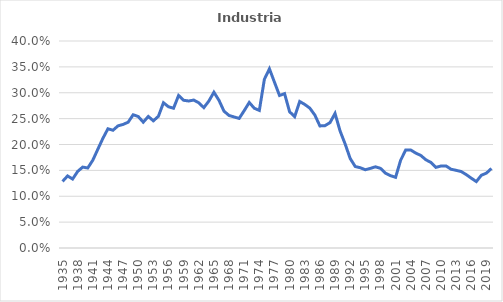
| Category | Industria manufacturera |
|---|---|
| 1935.0 | 0.129 |
| 1936.0 | 0.139 |
| 1937.0 | 0.133 |
| 1938.0 | 0.148 |
| 1939.0 | 0.156 |
| 1940.0 | 0.155 |
| 1941.0 | 0.17 |
| 1942.0 | 0.191 |
| 1943.0 | 0.212 |
| 1944.0 | 0.23 |
| 1945.0 | 0.228 |
| 1946.0 | 0.236 |
| 1947.0 | 0.239 |
| 1948.0 | 0.243 |
| 1949.0 | 0.257 |
| 1950.0 | 0.254 |
| 1951.0 | 0.243 |
| 1952.0 | 0.254 |
| 1953.0 | 0.246 |
| 1954.0 | 0.255 |
| 1955.0 | 0.281 |
| 1956.0 | 0.273 |
| 1957.0 | 0.27 |
| 1958.0 | 0.295 |
| 1959.0 | 0.285 |
| 1960.0 | 0.284 |
| 1961.0 | 0.286 |
| 1962.0 | 0.281 |
| 1963.0 | 0.271 |
| 1964.0 | 0.284 |
| 1965.0 | 0.301 |
| 1966.0 | 0.285 |
| 1967.0 | 0.264 |
| 1968.0 | 0.256 |
| 1969.0 | 0.253 |
| 1970.0 | 0.25 |
| 1971.0 | 0.265 |
| 1972.0 | 0.281 |
| 1973.0 | 0.27 |
| 1974.0 | 0.266 |
| 1975.0 | 0.326 |
| 1976.0 | 0.346 |
| 1977.0 | 0.32 |
| 1978.0 | 0.295 |
| 1979.0 | 0.298 |
| 1980.0 | 0.263 |
| 1981.0 | 0.254 |
| 1982.0 | 0.283 |
| 1983.0 | 0.277 |
| 1984.0 | 0.27 |
| 1985.0 | 0.257 |
| 1986.0 | 0.236 |
| 1987.0 | 0.236 |
| 1988.0 | 0.242 |
| 1989.0 | 0.26 |
| 1990.0 | 0.226 |
| 1991.0 | 0.201 |
| 1992.0 | 0.173 |
| 1993.0 | 0.157 |
| 1994.0 | 0.155 |
| 1995.0 | 0.151 |
| 1996.0 | 0.154 |
| 1997.0 | 0.157 |
| 1998.0 | 0.154 |
| 1999.0 | 0.145 |
| 2000.0 | 0.14 |
| 2001.0 | 0.137 |
| 2002.0 | 0.17 |
| 2003.0 | 0.189 |
| 2004.0 | 0.189 |
| 2005.0 | 0.183 |
| 2006.0 | 0.179 |
| 2007.0 | 0.17 |
| 2008.0 | 0.165 |
| 2009.0 | 0.156 |
| 2010.0 | 0.158 |
| 2011.0 | 0.159 |
| 2012.0 | 0.152 |
| 2013.0 | 0.15 |
| 2014.0 | 0.148 |
| 2015.0 | 0.142 |
| 2016.0 | 0.135 |
| 2017.0 | 0.128 |
| 2018.0 | 0.141 |
| 2019.0 | 0.145 |
| 2020.0 | 0.154 |